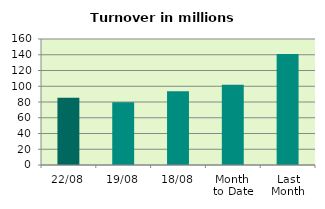
| Category | Series 0 |
|---|---|
| 22/08 | 85.501 |
| 19/08 | 79.691 |
| 18/08 | 93.688 |
| Month 
to Date | 101.956 |
| Last
Month | 140.832 |